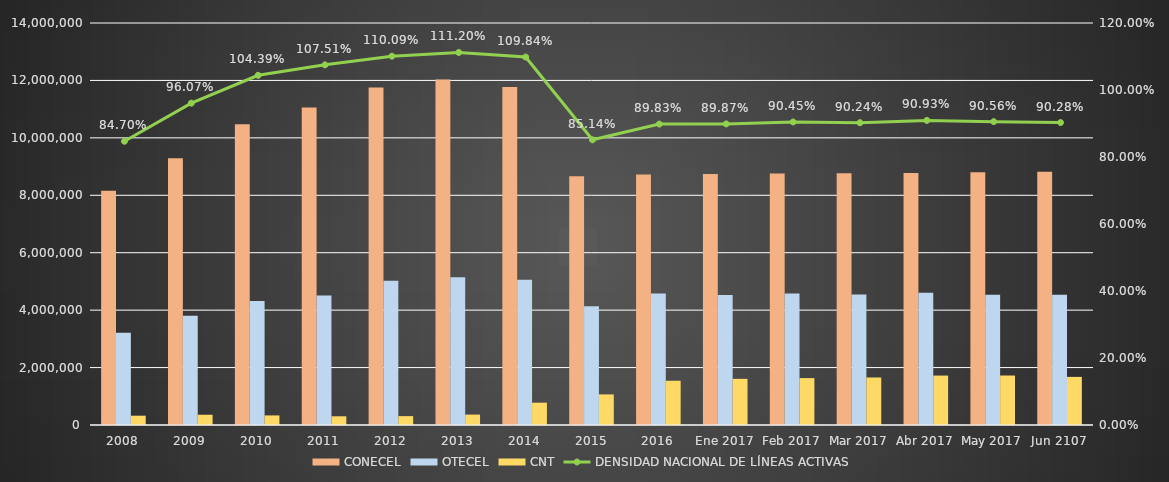
| Category | CONECEL | OTECEL | CNT |
|---|---|---|---|
| 2008 | 8156359 | 3211922 | 323967 |
| 2009 | 9291268 | 3806432 | 356900 |
| 2010 | 10470502 | 4314599 | 333730 |
| 2011 | 11057316 | 4513874 | 303368 |
| 2012 | 11757906 | 5019686 | 309271 |
| 2013 | 12030886 | 5148308 | 362560 |
| 2014 | 11772020 | 5055645 | 776892 |
| 2015 | 8658619 | 4134698 | 1065703 |
| 2016 | 8726823 | 4580092 | 1541219 |
| Ene 2017 | 8740818.931 | 4525750 | 1606657 |
| Feb 2017 | 8756687 | 4578932 | 1633862 |
| Mar 2017 | 8770831 | 4545105 | 1655131 |
| Abr 2017 | 8779728 | 4603330 | 1721409 |
| May 2017 | 8801222 | 4537153 | 1723483 |
| Jun 2107 | 8821576 | 4537153 | 1676146 |